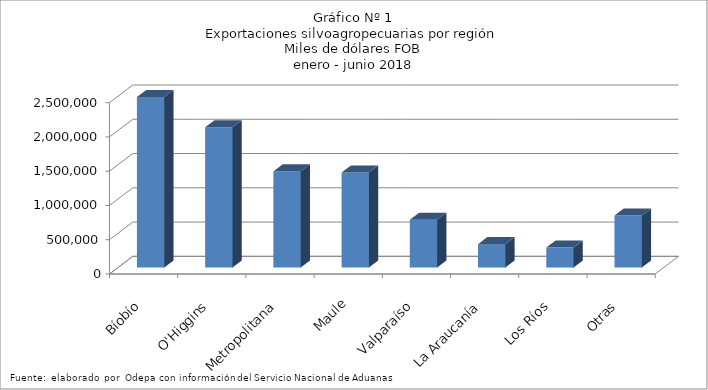
| Category | Series 0 |
|---|---|
| Bíobío | 2488781.311 |
| O'Higgins | 2045342.59 |
| Metropolitana | 1402538.735 |
| Maule | 1385796.888 |
| Valparaíso | 696996.644 |
| La Araucanía | 341394.788 |
| Los Ríos | 290467.043 |
| Otras | 758526.446 |